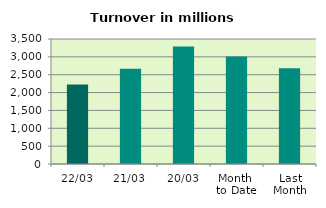
| Category | Series 0 |
|---|---|
| 22/03 | 2222.956 |
| 21/03 | 2669.621 |
| 20/03 | 3288.983 |
| Month 
to Date | 3010.274 |
| Last
Month | 2679.99 |